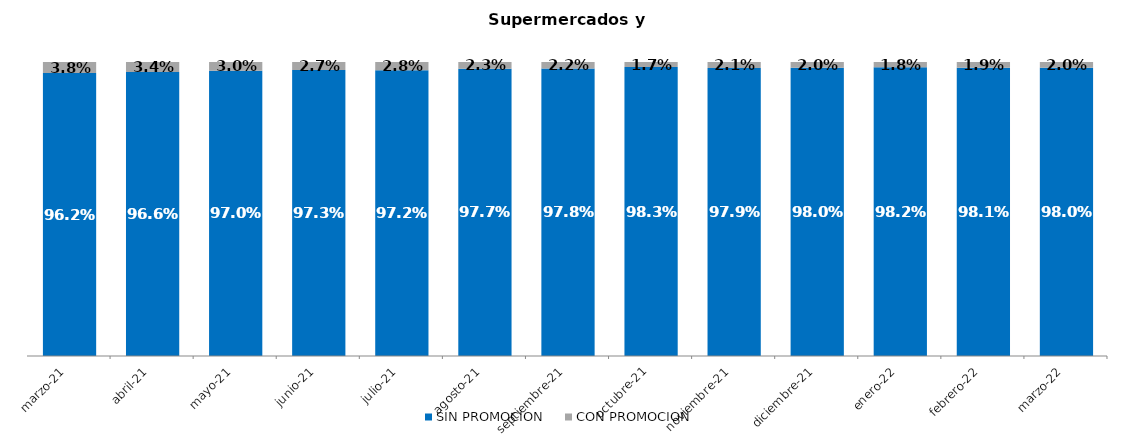
| Category | SIN PROMOCION   | CON PROMOCION   |
|---|---|---|
| 2021-03-01 | 0.962 | 0.038 |
| 2021-04-01 | 0.966 | 0.034 |
| 2021-05-01 | 0.97 | 0.03 |
| 2021-06-01 | 0.973 | 0.027 |
| 2021-07-01 | 0.972 | 0.028 |
| 2021-08-01 | 0.977 | 0.023 |
| 2021-09-01 | 0.978 | 0.022 |
| 2021-10-01 | 0.983 | 0.017 |
| 2021-11-01 | 0.979 | 0.021 |
| 2021-12-01 | 0.98 | 0.02 |
| 2022-01-01 | 0.982 | 0.018 |
| 2022-02-01 | 0.981 | 0.019 |
| 2022-03-01 | 0.98 | 0.02 |